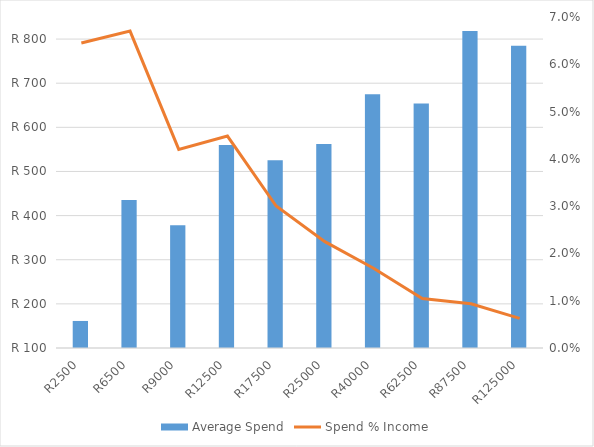
| Category | Average Spend |
|---|---|
| R2500 | 161.257 |
| R6500 | 435.577 |
| R9000 | 377.922 |
| R12500 | 560.177 |
| R17500 | 525.455 |
| R25000 | 562.5 |
| R40000 | 675.182 |
| R62500 | 654.237 |
| R87500 | 818.519 |
| R125000 | 784.615 |